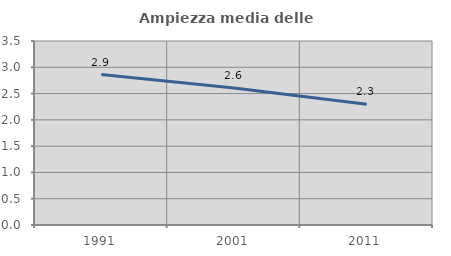
| Category | Ampiezza media delle famiglie |
|---|---|
| 1991.0 | 2.862 |
| 2001.0 | 2.608 |
| 2011.0 | 2.295 |